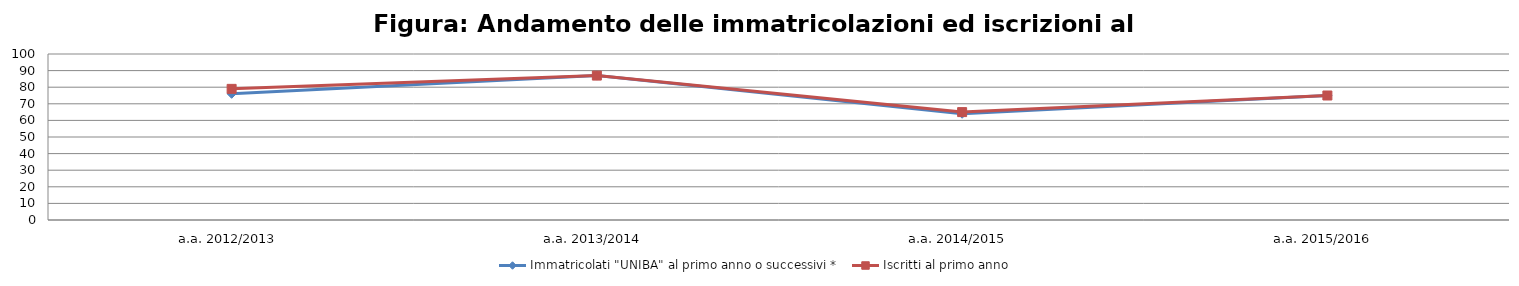
| Category | Immatricolati "UNIBA" al primo anno o successivi * | Iscritti al primo anno  |
|---|---|---|
| a.a. 2012/2013 | 76 | 79 |
| a.a. 2013/2014 | 87 | 87 |
| a.a. 2014/2015 | 64 | 65 |
| a.a. 2015/2016 | 75 | 75 |